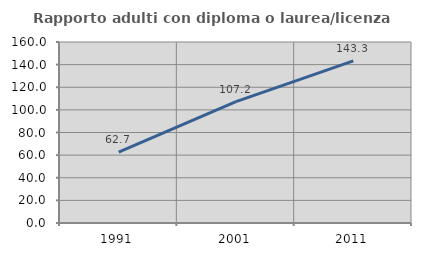
| Category | Rapporto adulti con diploma o laurea/licenza media  |
|---|---|
| 1991.0 | 62.712 |
| 2001.0 | 107.246 |
| 2011.0 | 143.284 |